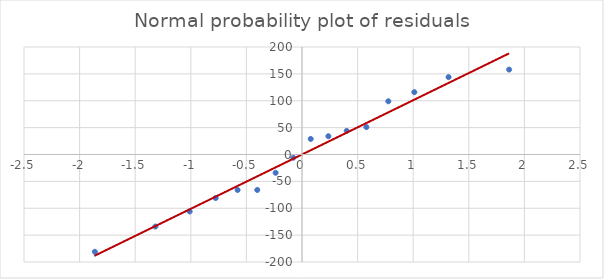
| Category | Series 0 |
|---|---|
| -1.862731867421651 | -181 |
| -1.3180108973035372 | -134 |
| -1.0099901692495805 | -106 |
| -0.7764217611479279 | -81 |
| -0.5791321622555559 | -66 |
| -0.40225006532172536 | -66 |
| -0.2372021093287877 | -34 |
| -0.07841241273311221 | -6 |
| 0.07841241273311221 | 29 |
| 0.2372021093287877 | 34 |
| 0.40225006532172536 | 44 |
| 0.5791321622555559 | 51 |
| 0.7764217611479279 | 99 |
| 1.0099901692495805 | 116 |
| 1.3180108973035372 | 144 |
| 1.862731867421651 | 158 |